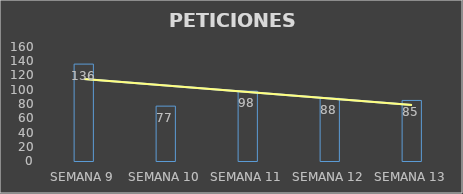
| Category | Series 0 |
|---|---|
| SEMANA 9 | 136 |
| SEMANA 10 | 77 |
| SEMANA 11 | 98 |
| SEMANA 12 | 88 |
| SEMANA 13 | 85 |